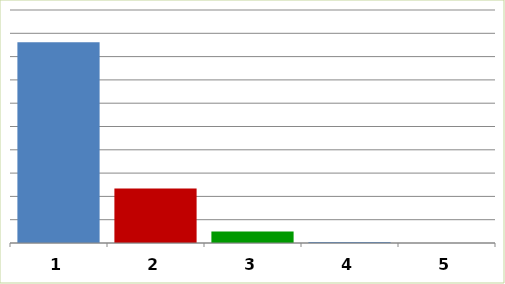
| Category | Series 0 |
|---|---|
| 0 | 86137782 |
| 1 | 23379590 |
| 2 | 4930000 |
| 3 | 450000 |
| 4 | 0 |